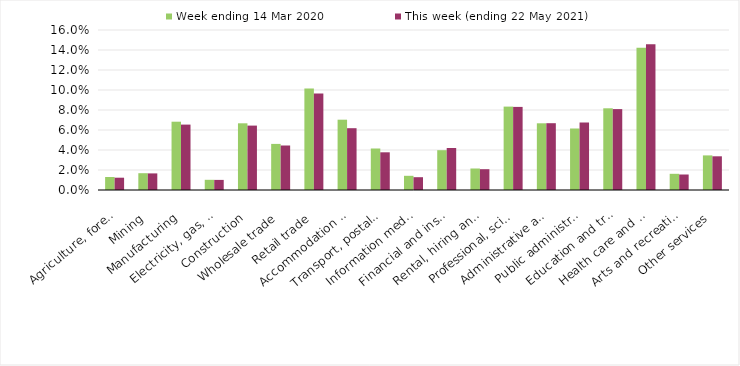
| Category | Week ending 14 Mar 2020 | This week (ending 22 May 2021) |
|---|---|---|
| Agriculture, forestry and fishing | 0.013 | 0.012 |
| Mining | 0.017 | 0.017 |
| Manufacturing | 0.068 | 0.065 |
| Electricity, gas, water and waste services | 0.01 | 0.01 |
| Construction | 0.067 | 0.064 |
| Wholesale trade | 0.046 | 0.044 |
| Retail trade | 0.102 | 0.096 |
| Accommodation and food services | 0.07 | 0.062 |
| Transport, postal and warehousing | 0.042 | 0.038 |
| Information media and telecommunications | 0.014 | 0.013 |
| Financial and insurance services | 0.04 | 0.042 |
| Rental, hiring and real estate services | 0.022 | 0.021 |
| Professional, scientific and technical services | 0.083 | 0.083 |
| Administrative and support services | 0.067 | 0.067 |
| Public administration and safety | 0.062 | 0.068 |
| Education and training | 0.082 | 0.081 |
| Health care and social assistance | 0.142 | 0.146 |
| Arts and recreation services | 0.016 | 0.016 |
| Other services | 0.035 | 0.034 |